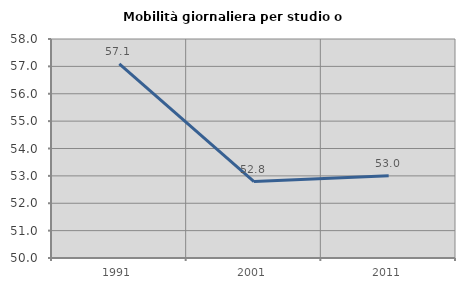
| Category | Mobilità giornaliera per studio o lavoro |
|---|---|
| 1991.0 | 57.093 |
| 2001.0 | 52.791 |
| 2011.0 | 53.001 |